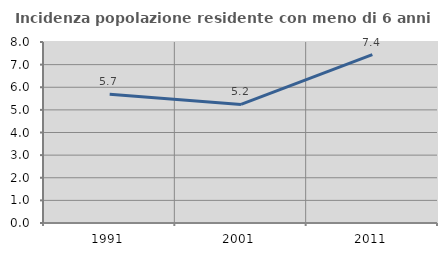
| Category | Incidenza popolazione residente con meno di 6 anni |
|---|---|
| 1991.0 | 5.695 |
| 2001.0 | 5.24 |
| 2011.0 | 7.438 |